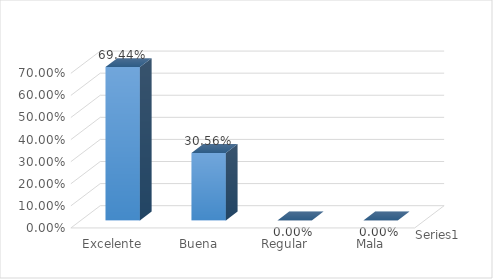
| Category | Series 0 |
|---|---|
| Excelente | 0.694 |
| Buena | 0.306 |
| Regular | 0 |
| Mala | 0 |